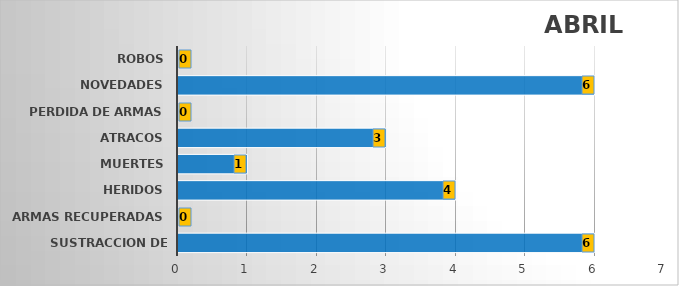
| Category | Series 1 |
|---|---|
| SUSTRACCION DE ARMAS | 6 |
| ARMAS RECUPERADAS | 0 |
| HERIDOS | 4 |
| MUERTES | 1 |
| ATRACOS | 3 |
| PERDIDA DE ARMAS | 0 |
| NOVEDADES | 6 |
| ROBOS | 0 |